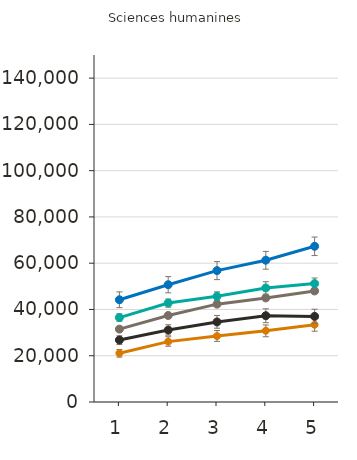
| Category | Certificat d'études collégial | Diplôme d'études collégial | Baccalauréat | Maîtrise | Doctorat | Grade professionnel |
|---|---|---|---|---|---|---|
| 1.0 | 21100 | 26800 | 31500 | 36500 | 44200 |  |
| 2.0 | 26100 | 31100 | 37400 | 42800 | 50700 |  |
| 3.0 | 28500 | 34600 | 42300 | 45700 | 56800 |  |
| 4.0 | 30800 | 37300 | 45000 | 49300 | 61300 |  |
| 5.0 | 33400 | 37000 | 48000 | 51200 | 67300 |  |